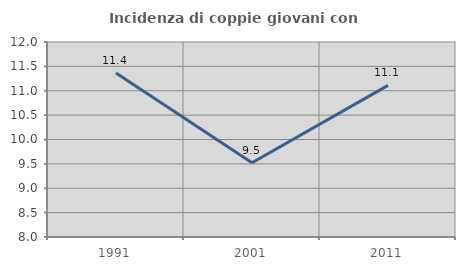
| Category | Incidenza di coppie giovani con figli |
|---|---|
| 1991.0 | 11.364 |
| 2001.0 | 9.524 |
| 2011.0 | 11.111 |